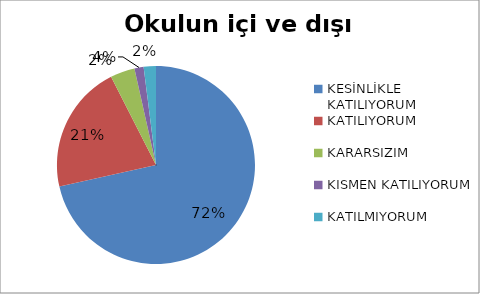
| Category | Okulun içi ve dışı temizdir. |
|---|---|
| KESİNLİKLE KATILIYORUM | 143 |
| KATILIYORUM | 42 |
| KARARSIZIM | 8 |
| KISMEN KATILIYORUM | 3 |
| KATILMIYORUM | 4 |